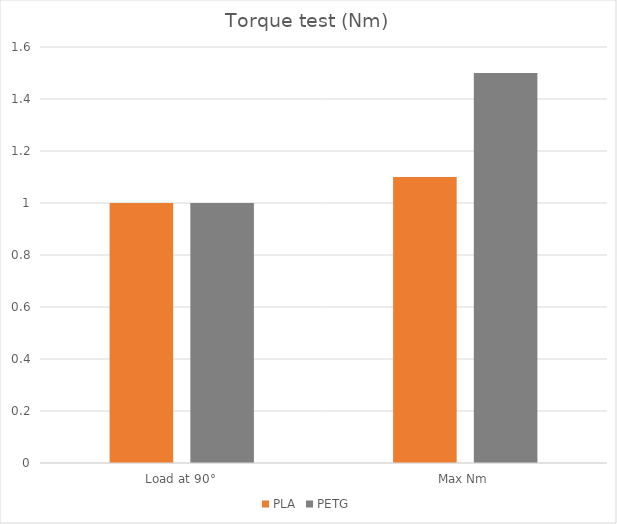
| Category | PLA | PETG |
|---|---|---|
| Load at 90° | 1 | 1 |
| Max Nm | 1.1 | 1.5 |